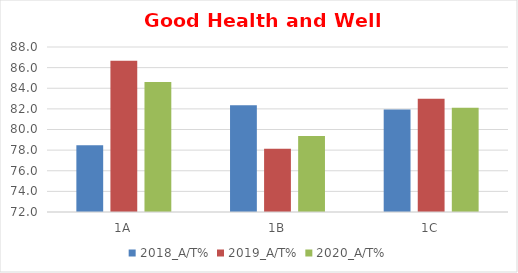
| Category | 2018_A/T% | 2019_A/T% | 2020_A/T% |
|---|---|---|---|
| 1A | 78.481 | 86.667 | 84.615 |
| 1B | 82.353 | 78.125 | 79.381 |
| 1C | 81.928 | 82.979 | 82.105 |